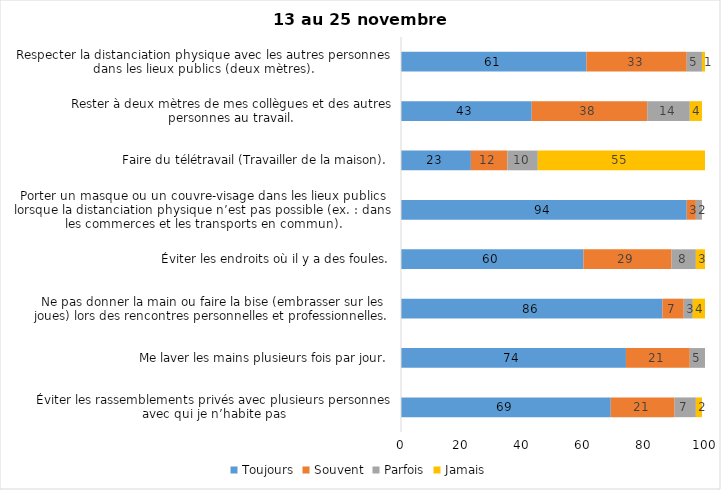
| Category | Toujours | Souvent | Parfois | Jamais |
|---|---|---|---|---|
| Éviter les rassemblements privés avec plusieurs personnes avec qui je n’habite pas | 69 | 21 | 7 | 2 |
| Me laver les mains plusieurs fois par jour. | 74 | 21 | 5 | 0 |
| Ne pas donner la main ou faire la bise (embrasser sur les joues) lors des rencontres personnelles et professionnelles. | 86 | 7 | 3 | 4 |
| Éviter les endroits où il y a des foules. | 60 | 29 | 8 | 3 |
| Porter un masque ou un couvre-visage dans les lieux publics lorsque la distanciation physique n’est pas possible (ex. : dans les commerces et les transports en commun). | 94 | 3 | 2 | 0 |
| Faire du télétravail (Travailler de la maison). | 23 | 12 | 10 | 55 |
| Rester à deux mètres de mes collègues et des autres personnes au travail. | 43 | 38 | 14 | 4 |
| Respecter la distanciation physique avec les autres personnes dans les lieux publics (deux mètres). | 61 | 33 | 5 | 1 |